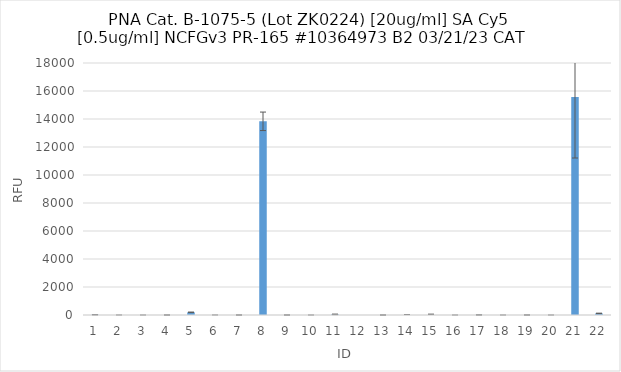
| Category | RFU |
|---|---|
| 0 | 18 |
| 1 | 0.75 |
| 2 | 0.25 |
| 3 | 1 |
| 4 | 191.5 |
| 5 | 1 |
| 6 | -0.25 |
| 7 | 13834.25 |
| 8 | -0.25 |
| 9 | 0.25 |
| 10 | 45 |
| 11 | -6.25 |
| 12 | 0 |
| 13 | -30 |
| 14 | -44 |
| 15 | 0.5 |
| 16 | 6.75 |
| 17 | 0.5 |
| 18 | -0.25 |
| 19 | 0.25 |
| 20 | 15570.5 |
| 21 | 114.25 |